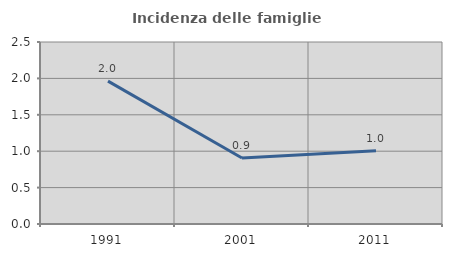
| Category | Incidenza delle famiglie numerose |
|---|---|
| 1991.0 | 1.962 |
| 2001.0 | 0.907 |
| 2011.0 | 1.007 |